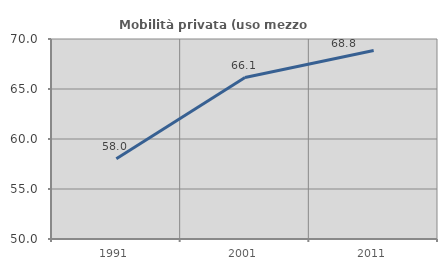
| Category | Mobilità privata (uso mezzo privato) |
|---|---|
| 1991.0 | 58.02 |
| 2001.0 | 66.149 |
| 2011.0 | 68.847 |